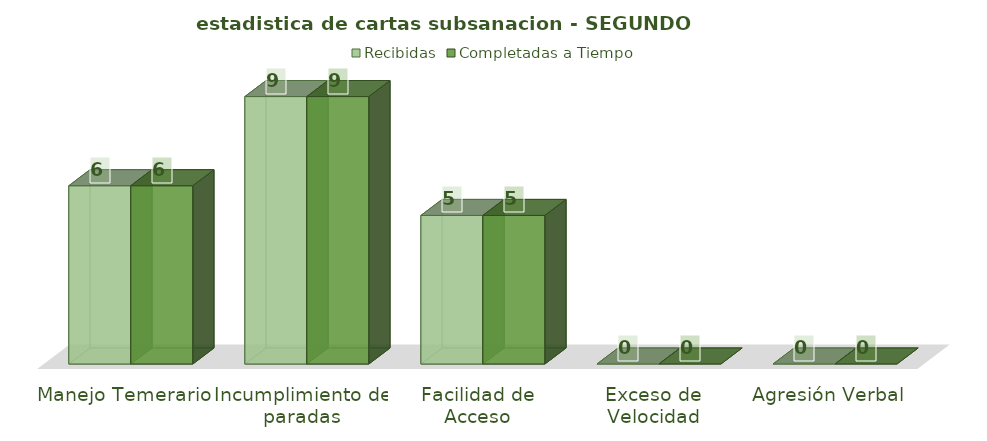
| Category | Recibidas | Completadas a Tiempo |
|---|---|---|
| Manejo Temerario | 6 | 6 |
| Incumplimiento de paradas | 9 | 9 |
| Facilidad de Acceso | 5 | 5 |
| Exceso de Velocidad | 0 | 0 |
| Agresión Verbal | 0 | 0 |